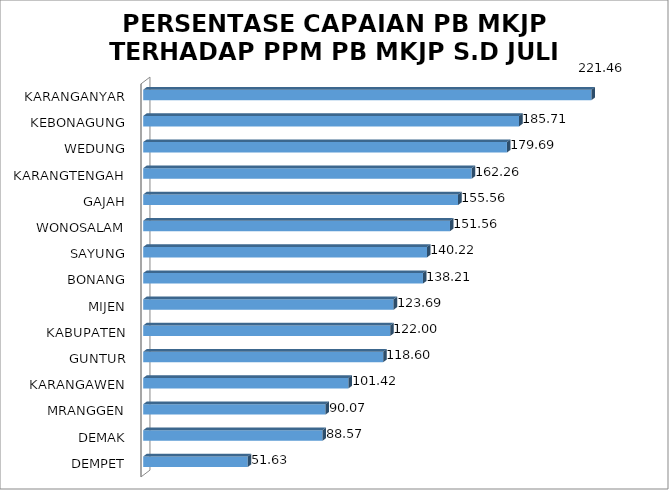
| Category | % PB MKJP |
|---|---|
| DEMPET | 51.63 |
| DEMAK | 88.57 |
| MRANGGEN | 90.07 |
| KARANGAWEN | 101.42 |
| GUNTUR | 118.6 |
| KABUPATEN | 122 |
| MIJEN | 123.69 |
| BONANG | 138.21 |
| SAYUNG | 140.22 |
| WONOSALAM | 151.56 |
| GAJAH | 155.56 |
| KARANGTENGAH | 162.26 |
| WEDUNG | 179.69 |
| KEBONAGUNG | 185.71 |
| KARANGANYAR | 221.46 |